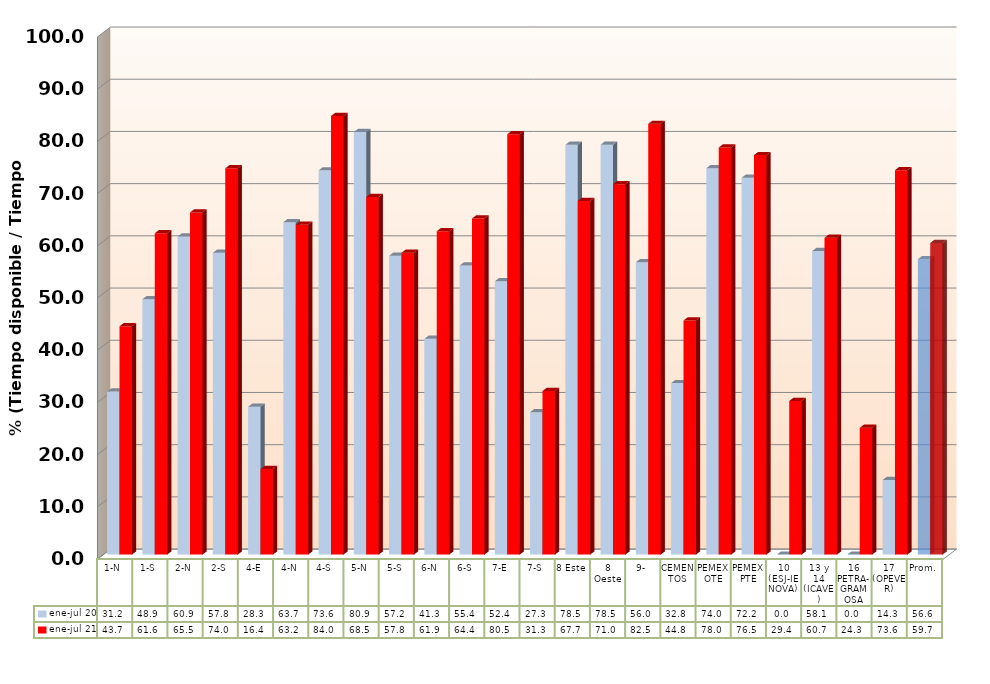
| Category | ene-jul 20 | ene-jul 21 |
|---|---|---|
| 1-N | 31.228 | 43.74 |
| 1-S | 48.907 | 61.561 |
| 2-N | 60.943 | 65.537 |
| 2-S | 57.815 | 73.983 |
| 4-E | 28.317 | 16.385 |
| 4-N | 63.675 | 63.186 |
| 4-S | 73.594 | 84 |
| 5-N | 80.943 | 68.499 |
| 5-S | 57.244 | 57.813 |
| 6-N | 41.328 | 61.941 |
| 6-S | 55.369 | 64.388 |
| 7-E | 52.359 | 80.526 |
| 7-S | 27.287 | 31.332 |
| 8 Este | 78.492 | 67.746 |
| 8 Oeste | 78.516 | 70.955 |
| 9- | 56.005 | 82.504 |
| CEMENTOS | 32.849 | 44.833 |
| PEMEX OTE | 74.021 | 77.979 |
| PEMEX PTE | 72.178 | 76.519 |
| 10 (ESJ-IENOVA) | 0 | 29.433 |
| 13 y 14 (ICAVE) | 58.135 | 60.684 |
| 16 PETRA-GRAMOSA | 0 | 24.294 |
| 17 (OPEVER) | 14.298 | 73.639 |
| Prom. | 56.587 | 59.696 |